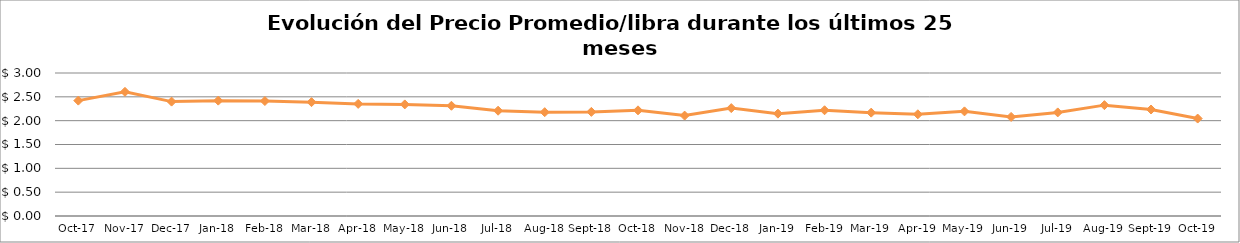
| Category | Series 0 |
|---|---|
| 2017-10-01 | 2.421 |
| 2017-11-01 | 2.605 |
| 2017-12-01 | 2.4 |
| 2018-01-01 | 2.42 |
| 2018-02-01 | 2.412 |
| 2018-03-01 | 2.388 |
| 2018-04-01 | 2.352 |
| 2018-05-01 | 2.341 |
| 2018-06-01 | 2.312 |
| 2018-07-01 | 2.209 |
| 2018-08-01 | 2.178 |
| 2018-09-01 | 2.184 |
| 2018-10-01 | 2.216 |
| 2018-11-01 | 2.106 |
| 2018-12-01 | 2.264 |
| 2019-01-01 | 2.147 |
| 2019-02-01 | 2.218 |
| 2019-03-01 | 2.169 |
| 2019-04-01 | 2.134 |
| 2019-05-01 | 2.195 |
| 2019-06-01 | 2.079 |
| 2019-07-01 | 2.173 |
| 2019-08-01 | 2.326 |
| 2019-09-01 | 2.234 |
| 2019-10-01 | 2.044 |